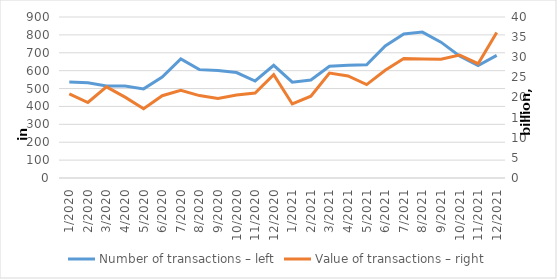
| Category | Number of transactions – left |
|---|---|
| 1/2020 | 536477 |
| 2/2020 | 531850 |
| 3/2020 | 513951 |
| 4/2020 | 514502 |
| 5/2020 | 498228 |
| 6/2020 | 564271 |
| 7/2020 | 665655 |
| 8/2020 | 605764 |
| 9/2020 | 600772 |
| 10/2020 | 589410 |
| 11/2020 | 542127 |
| 12/2020 | 629802 |
| 1/2021 | 535895 |
| 2/2021 | 547629 |
| 3/2021 | 625030 |
| 4/2021 | 630059 |
| 5/2021 | 632830 |
| 6/2021 | 738379 |
| 7/2021 | 805498 |
| 8/2021 | 815683 |
| 9/2021 | 759367 |
| 10/2021 | 682361 |
| 11/2021 | 629062 |
| 12/2021 | 685636 |